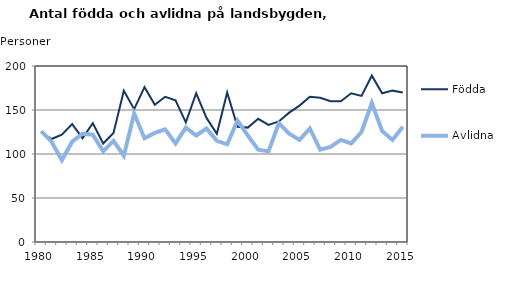
| Category | Födda | Avlidna |
|---|---|---|
| 1980.0 | 125 | 126 |
| 1981.0 | 117 | 114 |
| 1982.0 | 122 | 93 |
| 1983.0 | 134 | 114 |
| 1984.0 | 118 | 123 |
| 1985.0 | 135 | 122 |
| 1986.0 | 112 | 103 |
| 1987.0 | 124 | 115 |
| 1988.0 | 172 | 98 |
| 1989.0 | 151 | 146 |
| 1990.0 | 176 | 118 |
| 1991.0 | 156 | 124 |
| 1992.0 | 165 | 128 |
| 1993.0 | 161 | 112 |
| 1994.0 | 136 | 130 |
| 1995.0 | 169 | 121 |
| 1996.0 | 141 | 129 |
| 1997.0 | 123 | 115 |
| 1998.0 | 170 | 111 |
| 1999.0 | 131 | 138 |
| 2000.0 | 130 | 121 |
| 2001.0 | 140 | 105 |
| 2002.0 | 133 | 103 |
| 2003.0 | 137 | 135 |
| 2004.0 | 147 | 123 |
| 2005.0 | 155 | 116 |
| 2006.0 | 165 | 129 |
| 2007.0 | 164 | 105 |
| 2008.0 | 160 | 108 |
| 2009.0 | 160 | 116 |
| 2010.0 | 169 | 112 |
| 2011.0 | 166 | 125 |
| 2012.0 | 189 | 158 |
| 2013.0 | 169 | 126 |
| 2014.0 | 172 | 116 |
| 2015.0 | 170 | 131 |